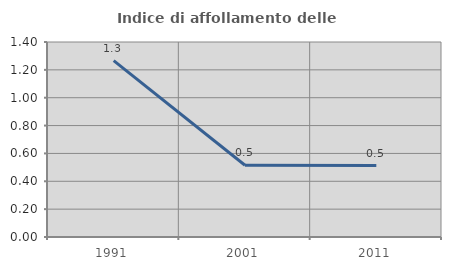
| Category | Indice di affollamento delle abitazioni  |
|---|---|
| 1991.0 | 1.266 |
| 2001.0 | 0.515 |
| 2011.0 | 0.513 |